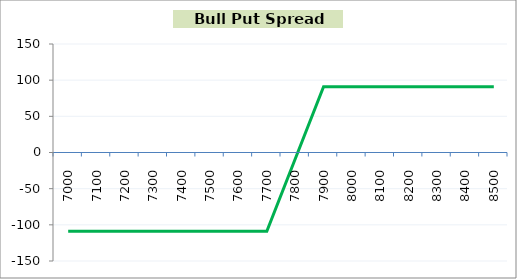
| Category | Series 1 |
|---|---|
| 7000.0 | -109 |
| 7100.0 | -109 |
| 7200.0 | -109 |
| 7300.0 | -109 |
| 7400.0 | -109 |
| 7500.0 | -109 |
| 7600.0 | -109 |
| 7700.0 | -109 |
| 7800.0 | -9 |
| 7900.0 | 91 |
| 8000.0 | 91 |
| 8100.0 | 91 |
| 8200.0 | 91 |
| 8300.0 | 91 |
| 8400.0 | 91 |
| 8500.0 | 91 |